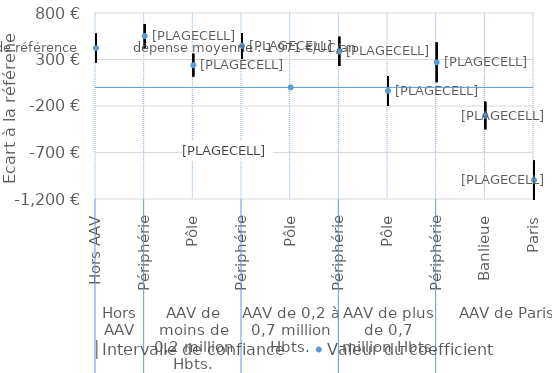
| Category | │Intervalle de confiance | Series 1 | Valeur du coefficient |
|---|---|---|---|
| 0 | 579.419 | 265.528 | 422.473 |
| 1 | 682.094 | 421.13 | 551.612 |
| 2 | 362.772 | 114.81 | 238.791 |
| 3 | 585.557 | 308.656 | 447.107 |
| 4 | 0 | 0 | 0 |
| 5 | 545.204 | 230.173 | 387.689 |
| 6 | 121.55 | -196.51 | -37.48 |
| 7 | 484.48 | 55.916 | 270.198 |
| 8 | -153.676 | -451.543 | -302.61 |
| 9 | -785.871 | -1210 | -997.131 |